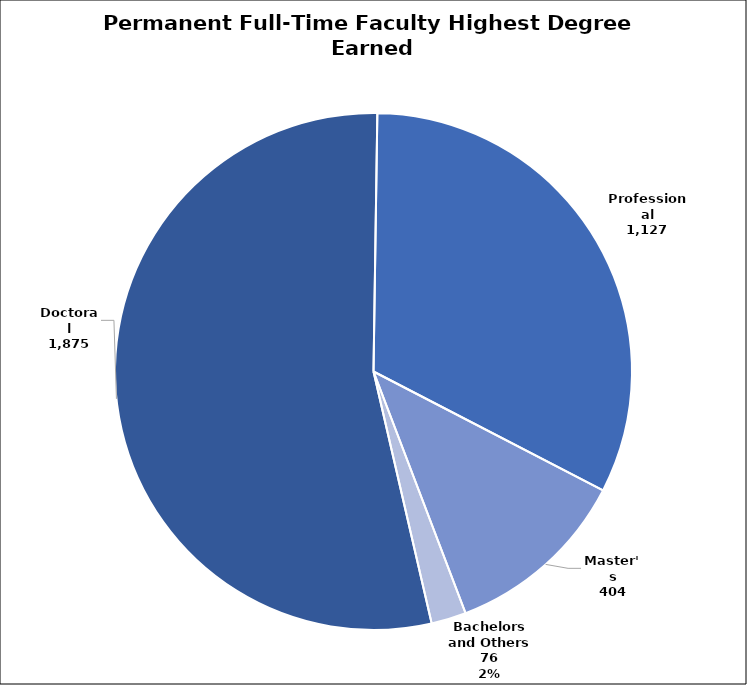
| Category | Count |
|---|---|
| Doctoral | 1875 |
| Professional | 1127 |
| Master's | 404 |
| Bachelors and Others | 76 |